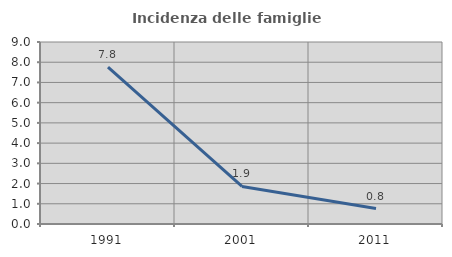
| Category | Incidenza delle famiglie numerose |
|---|---|
| 1991.0 | 7.763 |
| 2001.0 | 1.857 |
| 2011.0 | 0.762 |